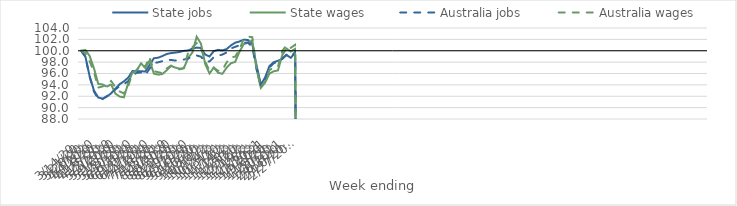
| Category | State jobs | State wages | Australia jobs | Australia wages |
|---|---|---|---|---|
| 14/03/2020 | 100 | 100 | 100 | 100 |
| 21/03/2020 | 98.947 | 100.143 | 98.956 | 99.591 |
| 28/03/2020 | 95.477 | 99.064 | 95.412 | 98.115 |
| 04/04/2020 | 92.998 | 96.905 | 92.813 | 96.238 |
| 11/04/2020 | 91.774 | 94.179 | 91.52 | 93.527 |
| 18/04/2020 | 91.579 | 94.077 | 91.497 | 93.722 |
| 25/04/2020 | 91.928 | 93.678 | 92.022 | 94.132 |
| 02/05/2020 | 92.509 | 94.109 | 92.516 | 94.683 |
| 09/05/2020 | 93.322 | 92.471 | 93.196 | 93.606 |
| 16/05/2020 | 94.122 | 91.938 | 93.786 | 92.839 |
| 23/05/2020 | 94.626 | 91.817 | 94.143 | 92.495 |
| 30/05/2020 | 95.271 | 94.304 | 94.652 | 93.805 |
| 06/06/2020 | 96.434 | 96.203 | 95.638 | 95.989 |
| 13/06/2020 | 96.429 | 96.555 | 96.141 | 96.647 |
| 20/06/2020 | 96.398 | 97.786 | 96.161 | 97.556 |
| 27/06/2020 | 96.351 | 96.952 | 95.749 | 97.243 |
| 04/07/2020 | 97.494 | 98.286 | 96.855 | 98.903 |
| 11/07/2020 | 98.683 | 95.98 | 97.864 | 96.396 |
| 18/07/2020 | 98.778 | 95.802 | 97.96 | 96.236 |
| 25/07/2020 | 99.068 | 95.905 | 98.177 | 96.05 |
| 01/08/2020 | 99.426 | 96.573 | 98.391 | 96.89 |
| 08/08/2020 | 99.589 | 97.351 | 98.384 | 97.377 |
| 15/08/2020 | 99.674 | 97.033 | 98.275 | 96.882 |
| 22/08/2020 | 99.79 | 96.85 | 98.328 | 96.723 |
| 29/08/2020 | 99.973 | 96.916 | 98.458 | 96.942 |
| 05/09/2020 | 100.046 | 98.728 | 98.618 | 99.637 |
| 12/09/2020 | 100.371 | 99.699 | 99.017 | 100.615 |
| 19/09/2020 | 100.554 | 102.464 | 99.166 | 101.346 |
| 26/09/2020 | 100.478 | 101.249 | 98.953 | 100.497 |
| 03/10/2020 | 99.33 | 97.66 | 98.095 | 98.1 |
| 10/10/2020 | 98.991 | 96.016 | 98.121 | 96.45 |
| 17/10/2020 | 99.929 | 97.031 | 98.87 | 97.028 |
| 24/10/2020 | 100.158 | 96.14 | 99.128 | 96.463 |
| 31/10/2020 | 100.056 | 95.943 | 99.332 | 96.583 |
| 07/11/2020 | 100.297 | 97.017 | 99.7 | 97.947 |
| 14/11/2020 | 100.931 | 97.804 | 100.404 | 98.872 |
| 21/11/2020 | 101.42 | 98.041 | 100.686 | 98.947 |
| 28/11/2020 | 101.63 | 99.836 | 100.954 | 100.289 |
| 05/12/2020 | 101.944 | 101.148 | 101.418 | 102.049 |
| 12/12/2020 | 101.886 | 101.416 | 101.44 | 102.491 |
| 19/12/2020 | 101.16 | 101.801 | 100.619 | 102.382 |
| 26/12/2020 | 97.415 | 96.738 | 96.814 | 96.897 |
| 02/01/2021 | 94.049 | 93.476 | 93.894 | 93.496 |
| 09/01/2021 | 95.313 | 94.395 | 95.102 | 94.672 |
| 16/01/2021 | 97.295 | 95.978 | 97.043 | 96.593 |
| 23/01/2021 | 97.981 | 96.389 | 97.81 | 97.069 |
| 30/01/2021 | 98.242 | 96.539 | 98.097 | 97.188 |
| 06/02/2021 | 98.57 | 99.236 | 98.579 | 99.942 |
| 13/02/2021 | 99.264 | 100.399 | 99.324 | 101.024 |
| 20/02/2021 | 98.759 | 99.855 | 98.998 | 100.508 |
| 27/02/2021 | 99.643 | 100.322 | 99.758 | 101.044 |